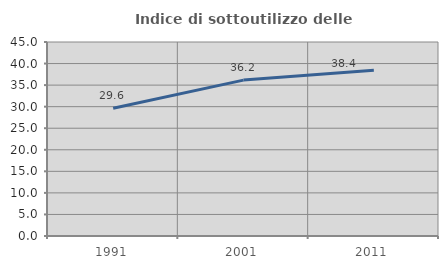
| Category | Indice di sottoutilizzo delle abitazioni  |
|---|---|
| 1991.0 | 29.644 |
| 2001.0 | 36.163 |
| 2011.0 | 38.438 |